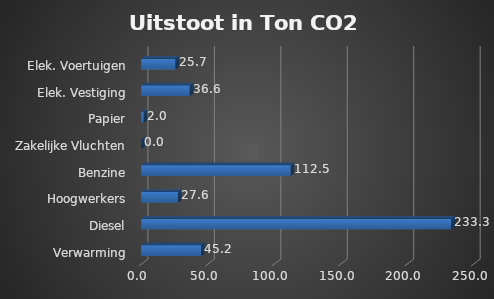
| Category | Series 0 |
|---|---|
| Verwarming | 45.182 |
| Diesel | 233.327 |
| Hoogwerkers | 27.629 |
| Benzine | 112.453 |
| Zakelijke Vluchten | 0 |
| Papier | 1.965 |
| Elek. Vestiging | 36.569 |
| Elek. Voertuigen | 25.741 |